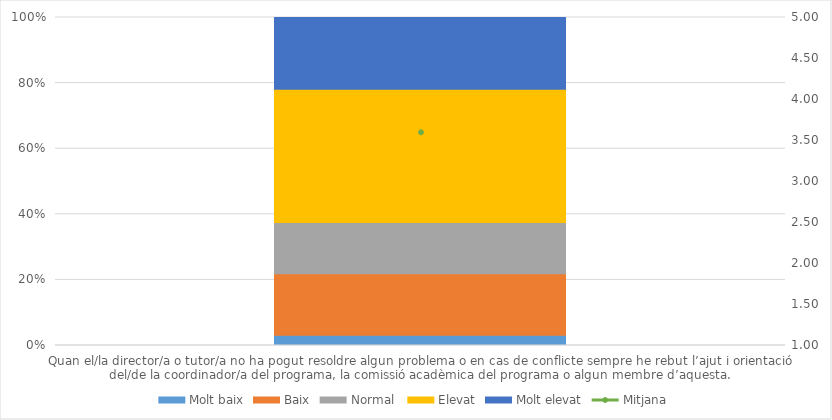
| Category | Molt baix | Baix | Normal  | Elevat | Molt elevat |
|---|---|---|---|---|---|
| Quan el/la director/a o tutor/a no ha pogut resoldre algun problema o en cas de conflicte sempre he rebut l’ajut i orientació del/de la coordinador/a del programa, la comissió acadèmica del programa o algun membre d’aquesta. | 1 | 6 | 5 | 13 | 7 |